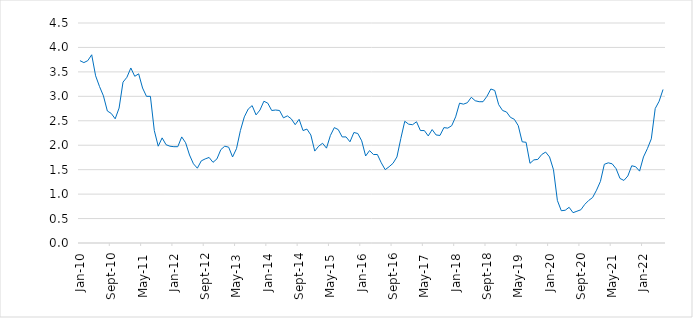
| Category | Series 0 |
|---|---|
| 2010-01-01 | 3.73 |
| 2010-02-01 | 3.69 |
| 2010-03-01 | 3.73 |
| 2010-04-01 | 3.85 |
| 2010-05-01 | 3.42 |
| 2010-06-01 | 3.2 |
| 2010-07-01 | 3.01 |
| 2010-08-01 | 2.7 |
| 2010-09-01 | 2.65 |
| 2010-10-01 | 2.54 |
| 2010-11-01 | 2.76 |
| 2010-12-01 | 3.29 |
| 2011-01-01 | 3.39 |
| 2011-02-01 | 3.58 |
| 2011-03-01 | 3.41 |
| 2011-04-01 | 3.46 |
| 2011-05-01 | 3.17 |
| 2011-06-01 | 3 |
| 2011-07-01 | 3 |
| 2011-08-01 | 2.3 |
| 2011-09-01 | 1.98 |
| 2011-10-01 | 2.15 |
| 2011-11-01 | 2.01 |
| 2011-12-01 | 1.98 |
| 2012-01-01 | 1.97 |
| 2012-02-01 | 1.97 |
| 2012-03-01 | 2.17 |
| 2012-04-01 | 2.05 |
| 2012-05-01 | 1.8 |
| 2012-06-01 | 1.62 |
| 2012-07-01 | 1.53 |
| 2012-08-01 | 1.68 |
| 2012-09-01 | 1.72 |
| 2012-10-01 | 1.75 |
| 2012-11-01 | 1.65 |
| 2012-12-01 | 1.72 |
| 2013-01-01 | 1.91 |
| 2013-02-01 | 1.98 |
| 2013-03-01 | 1.96 |
| 2013-04-01 | 1.76 |
| 2013-05-01 | 1.93 |
| 2013-06-01 | 2.3 |
| 2013-07-01 | 2.58 |
| 2013-08-01 | 2.74 |
| 2013-09-01 | 2.81 |
| 2013-10-01 | 2.62 |
| 2013-11-01 | 2.72 |
| 2013-12-01 | 2.9 |
| 2014-01-01 | 2.86 |
| 2014-02-01 | 2.71 |
| 2014-03-01 | 2.72 |
| 2014-04-01 | 2.71 |
| 2014-05-01 | 2.56 |
| 2014-06-01 | 2.6 |
| 2014-07-01 | 2.54 |
| 2014-08-01 | 2.42 |
| 2014-09-01 | 2.53 |
| 2014-10-01 | 2.3 |
| 2014-11-01 | 2.33 |
| 2014-12-01 | 2.21 |
| 2015-01-01 | 1.88 |
| 2015-02-01 | 1.98 |
| 2015-03-01 | 2.04 |
| 2015-04-01 | 1.94 |
| 2015-05-01 | 2.2 |
| 2015-06-01 | 2.36 |
| 2015-07-01 | 2.32 |
| 2015-08-01 | 2.17 |
| 2015-09-01 | 2.17 |
| 2015-10-01 | 2.07 |
| 2015-11-01 | 2.26 |
| 2015-12-01 | 2.24 |
| 2016-01-01 | 2.09 |
| 2016-02-01 | 1.78 |
| 2016-03-01 | 1.89 |
| 2016-04-01 | 1.81 |
| 2016-05-01 | 1.81 |
| 2016-06-01 | 1.64 |
| 2016-07-01 | 1.5 |
| 2016-08-01 | 1.56 |
| 2016-09-01 | 1.63 |
| 2016-10-01 | 1.76 |
| 2016-11-01 | 2.14 |
| 2016-12-01 | 2.49 |
| 2017-01-01 | 2.43 |
| 2017-02-01 | 2.42 |
| 2017-03-01 | 2.48 |
| 2017-04-01 | 2.3 |
| 2017-05-01 | 2.3 |
| 2017-06-01 | 2.19 |
| 2017-07-01 | 2.32 |
| 2017-08-01 | 2.21 |
| 2017-09-01 | 2.2 |
| 2017-10-01 | 2.36 |
| 2017-11-01 | 2.35 |
| 2017-12-01 | 2.4 |
| 2018-01-01 | 2.58 |
| 2018-02-01 | 2.86 |
| 2018-03-01 | 2.84 |
| 2018-04-01 | 2.87 |
| 2018-05-01 | 2.98 |
| 2018-06-01 | 2.91 |
| 2018-07-01 | 2.89 |
| 2018-08-01 | 2.89 |
| 2018-09-01 | 3 |
| 2018-10-01 | 3.15 |
| 2018-11-01 | 3.12 |
| 2018-12-01 | 2.83 |
| 2019-01-01 | 2.71 |
| 2019-02-01 | 2.68 |
| 2019-03-01 | 2.57 |
| 2019-04-01 | 2.53 |
| 2019-05-01 | 2.4 |
| 2019-06-01 | 2.07 |
| 2019-07-01 | 2.06 |
| 2019-08-01 | 1.63 |
| 2019-09-01 | 1.7 |
| 2019-10-01 | 1.71 |
| 2019-11-01 | 1.81 |
| 2019-12-01 | 1.86 |
| 2020-01-01 | 1.76 |
| 2020-02-01 | 1.5 |
| 2020-03-01 | 0.87 |
| 2020-04-01 | 0.66 |
| 2020-05-01 | 0.67 |
| 2020-06-01 | 0.73 |
| 2020-07-01 | 0.62 |
| 2020-08-01 | 0.65 |
| 2020-09-01 | 0.68 |
| 2020-10-01 | 0.79 |
| 2020-11-01 | 0.87 |
| 2020-12-01 | 0.93 |
| 2021-01-01 | 1.08 |
| 2021-02-01 | 1.26 |
| 2021-03-01 | 1.61 |
| 2021-04-01 | 1.64 |
| 2021-05-01 | 1.62 |
| 2021-06-01 | 1.52 |
| 2021-07-01 | 1.32 |
| 2021-08-01 | 1.28 |
| 2021-09-01 | 1.37 |
| 2021-10-01 | 1.58 |
| 2021-11-01 | 1.56 |
| 2021-12-01 | 1.47 |
| 2022-01-01 | 1.76 |
| 2022-02-01 | 1.93 |
| 2022-03-01 | 2.13 |
| 2022-04-01 | 2.75 |
| 2022-05-01 | 2.9 |
| 2022-06-01 | 3.14 |